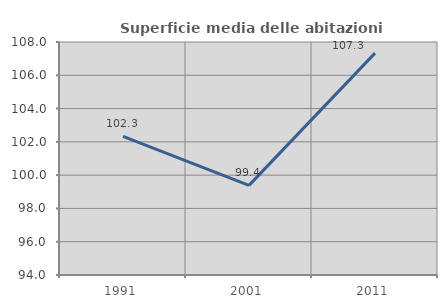
| Category | Superficie media delle abitazioni occupate |
|---|---|
| 1991.0 | 102.329 |
| 2001.0 | 99.385 |
| 2011.0 | 107.33 |